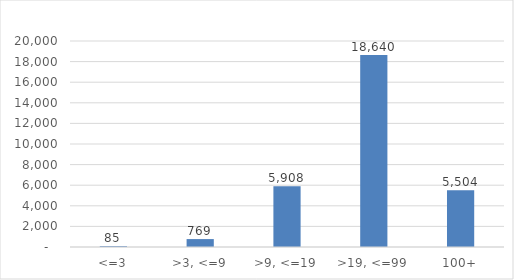
| Category |  Employees |
|---|---|
| <=3 | 85.1 |
| >3, <=9 | 769.3 |
| >9, <=19 | 5908 |
| >19, <=99 | 18640.2 |
| 100+ | 5504 |